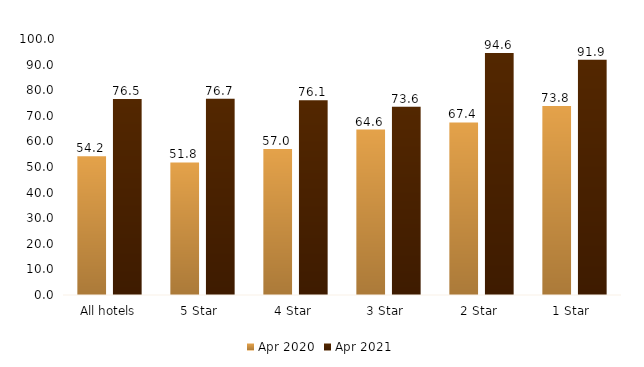
| Category | Apr 2020 | Apr 2021 |
|---|---|---|
| All hotels | 54.157 | 76.534 |
| 5 Star  | 51.804 | 76.676 |
| 4 Star  | 57.024 | 76.085 |
| 3 Star  | 64.647 | 73.556 |
| 2 Star  | 67.422 | 94.578 |
| 1 Star  | 73.842 | 91.943 |